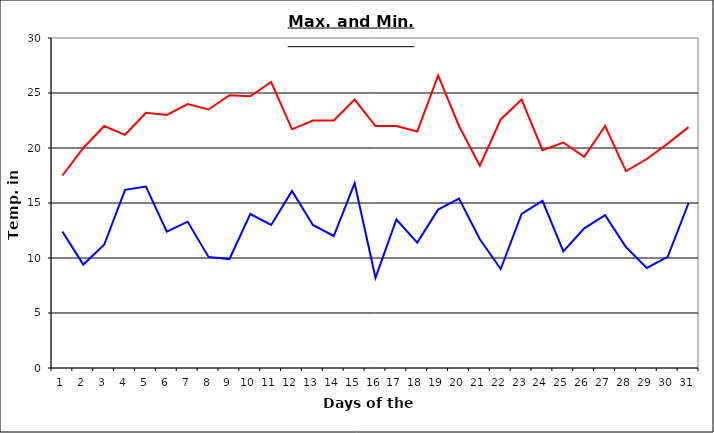
| Category | Series 0 | Series 1 |
|---|---|---|
| 0 | 17.5 | 12.4 |
| 1 | 20 | 9.4 |
| 2 | 22 | 11.2 |
| 3 | 21.2 | 16.2 |
| 4 | 23.2 | 16.5 |
| 5 | 23 | 12.4 |
| 6 | 24 | 13.3 |
| 7 | 23.5 | 10.1 |
| 8 | 24.8 | 9.9 |
| 9 | 24.7 | 14 |
| 10 | 26 | 13 |
| 11 | 21.7 | 16.1 |
| 12 | 22.5 | 13 |
| 13 | 22.5 | 12 |
| 14 | 24.4 | 16.8 |
| 15 | 22 | 8.2 |
| 16 | 22 | 13.5 |
| 17 | 21.5 | 11.4 |
| 18 | 26.6 | 14.4 |
| 19 | 22 | 15.4 |
| 20 | 18.4 | 11.7 |
| 21 | 22.6 | 9 |
| 22 | 24.4 | 14 |
| 23 | 19.8 | 15.2 |
| 24 | 20.5 | 10.6 |
| 25 | 19.2 | 12.7 |
| 26 | 22 | 13.9 |
| 27 | 17.9 | 11 |
| 28 | 19 | 9.1 |
| 29 | 20.4 | 10.1 |
| 30 | 21.9 | 15 |